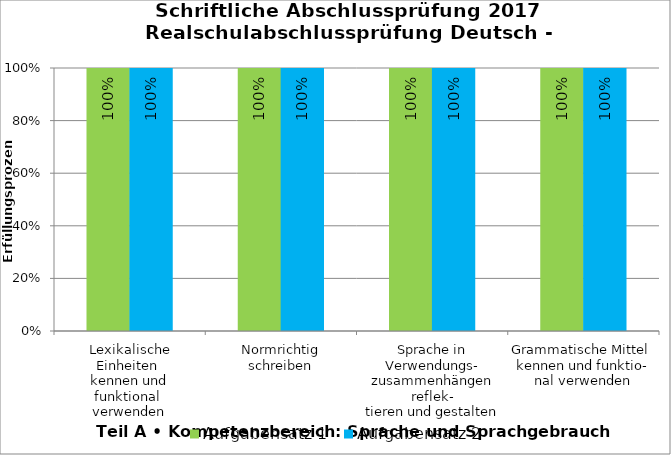
| Category | Aufgabensatz 1 | Aufgabensatz 2 |
|---|---|---|
| Lexikalische Einheiten 
kennen und funktional 
verwenden | 1 | 1 |
| Normrichtig
schreiben | 1 | 1 |
| Sprache in Verwendungs-
zusammenhängen reflek-
tieren und gestalten | 1 | 1 |
| Grammatische Mittel 
kennen und funktio-
nal verwenden | 1 | 1 |